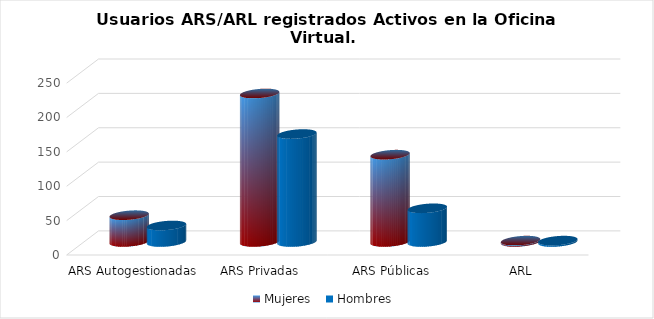
| Category | Mujeres | Hombres |
|---|---|---|
| ARS Autogestionadas | 39 | 24 |
| ARS Privadas | 216 | 157 |
| ARS Públicas | 127 | 49 |
| ARL | 2 | 2 |